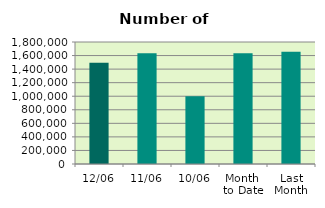
| Category | Series 0 |
|---|---|
| 12/06 | 1492058 |
| 11/06 | 1632918 |
| 10/06 | 999930 |
| Month 
to Date | 1633164.75 |
| Last
Month | 1656073.545 |